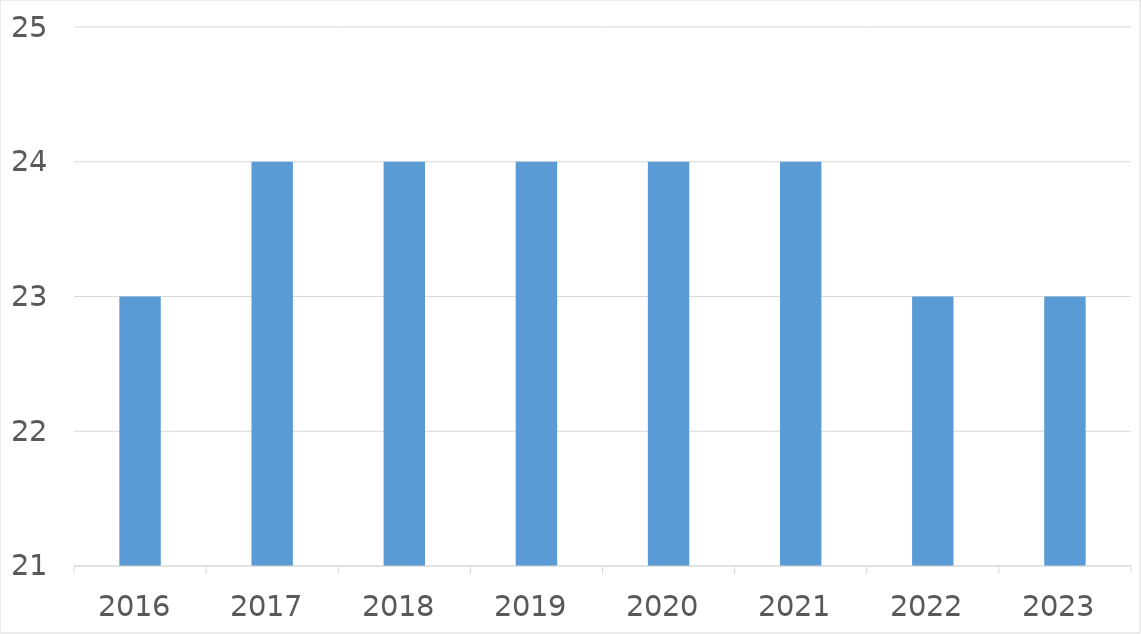
| Category | Series 0 |
|---|---|
| 2016 | 23 |
| 2017 | 24 |
| 2018 | 24 |
| 2019 | 24 |
| 2020 | 24 |
| 2021 | 24 |
| 2022 | 23 |
| 2023 | 23 |